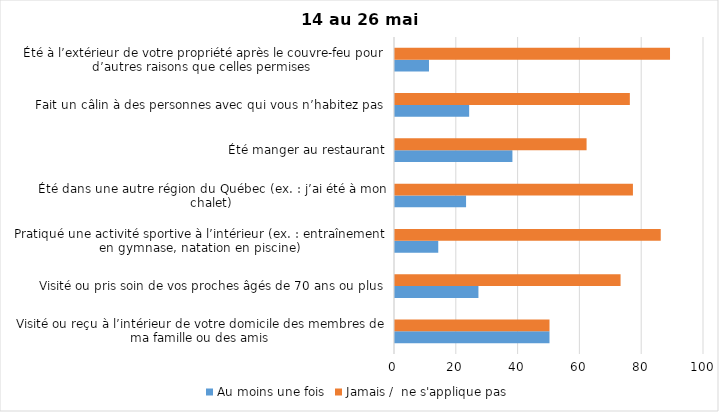
| Category | Au moins une fois | Jamais /  ne s'applique pas |
|---|---|---|
| Visité ou reçu à l’intérieur de votre domicile des membres de ma famille ou des amis | 50 | 50 |
| Visité ou pris soin de vos proches âgés de 70 ans ou plus | 27 | 73 |
| Pratiqué une activité sportive à l’intérieur (ex. : entraînement en gymnase, natation en piscine) | 14 | 86 |
| Été dans une autre région du Québec (ex. : j’ai été à mon chalet) | 23 | 77 |
| Été manger au restaurant | 38 | 62 |
| Fait un câlin à des personnes avec qui vous n’habitez pas | 24 | 76 |
| Été à l’extérieur de votre propriété après le couvre-feu pour d’autres raisons que celles permises  | 11 | 89 |